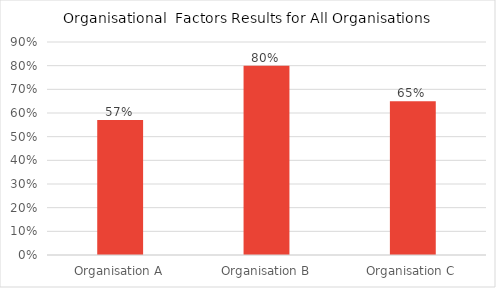
| Category | Organisation Factors |
|---|---|
| Organisation A | 0.57 |
| Organisation B | 0.8 |
| Organisation C | 0.65 |